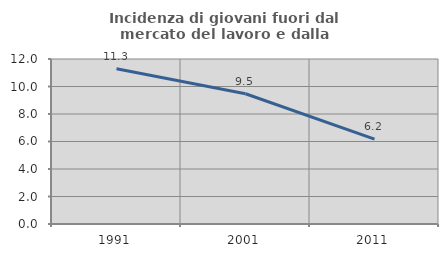
| Category | Incidenza di giovani fuori dal mercato del lavoro e dalla formazione  |
|---|---|
| 1991.0 | 11.29 |
| 2001.0 | 9.474 |
| 2011.0 | 6.17 |